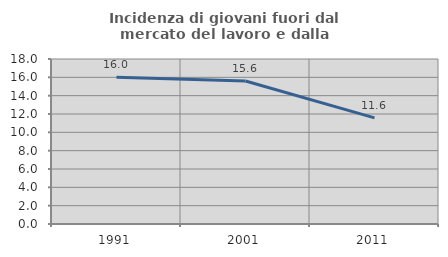
| Category | Incidenza di giovani fuori dal mercato del lavoro e dalla formazione  |
|---|---|
| 1991.0 | 16.017 |
| 2001.0 | 15.598 |
| 2011.0 | 11.581 |